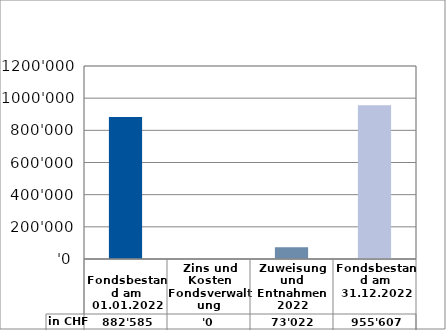
| Category | in CHF |
|---|---|
| 
Fondsbestand am 01.01.2022

 | 882585.2 |
| Zins und Kosten Fondsverwaltung | 0 |
| Zuweisung und Entnahmen 2022 | 73021.7 |
| Fondsbestand am 31.12.2022 | 955606.9 |